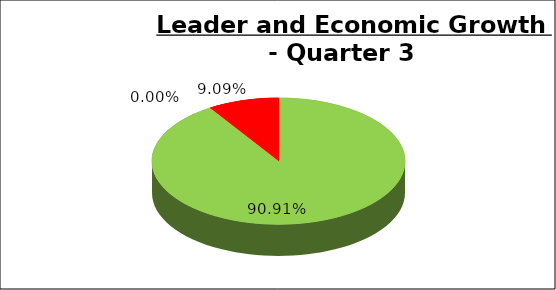
| Category | Q3 |
|---|---|
| Green | 0.909 |
| Amber | 0 |
| Red | 0.091 |